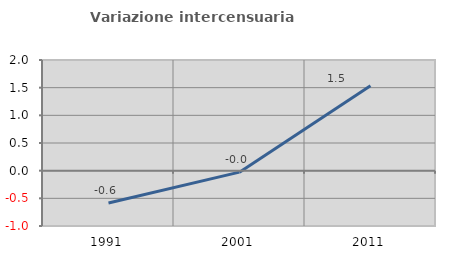
| Category | Variazione intercensuaria annua |
|---|---|
| 1991.0 | -0.583 |
| 2001.0 | -0.027 |
| 2011.0 | 1.534 |